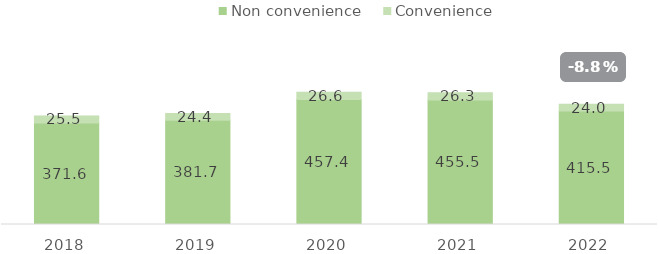
| Category | Non convenience | Convenience |
|---|---|---|
| 2018.0 | 371.594 | 25.535 |
| 2019.0 | 381.664 | 24.445 |
| 2020.0 | 457.377 | 26.612 |
| 2021.0 | 455.456 | 26.339 |
| 2022.0 | 415.499 | 23.983 |